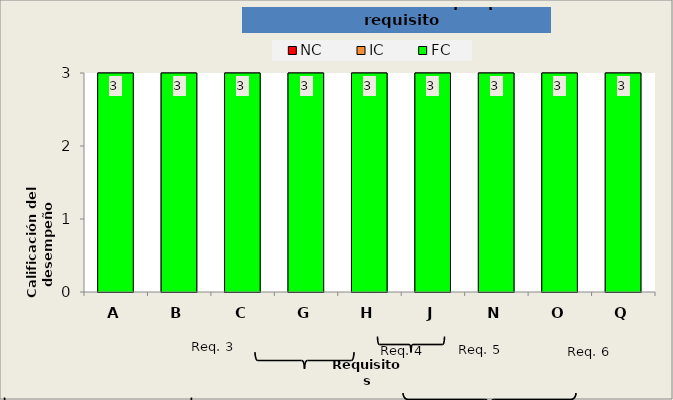
| Category | Calificación del desempeño | NC | IC | FC |
|---|---|---|---|---|
| A | 3 | 0 | 0 | 3 |
| B | 3 | 0 | 0 | 3 |
| C | 3 | 0 | 0 | 3 |
| G | 3 | 0 | 0 | 3 |
| H | 3 | 0 | 0 | 3 |
| J | 3 | 0 | 0 | 3 |
| N | 3 | 0 | 0 | 3 |
| O | 3 | 0 | 0 | 3 |
| Q | 3 | 0 | 0 | 3 |